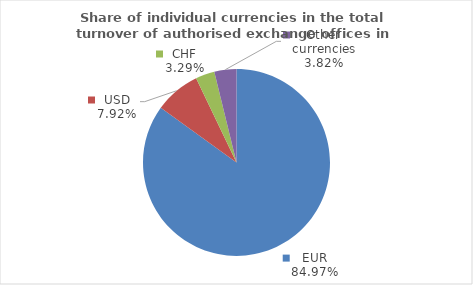
| Category | Series 0 |
|---|---|
| EUR | 84.972 |
| USD | 7.923 |
| CHF | 3.285 |
| Other currencies | 3.821 |